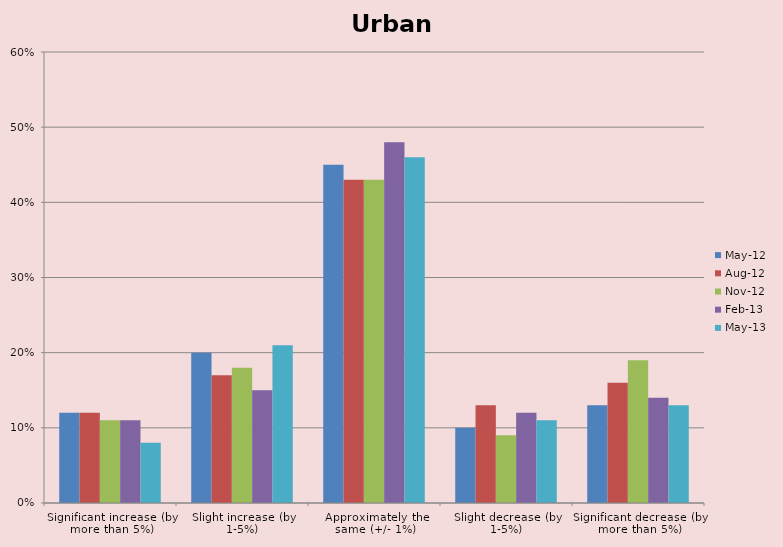
| Category | May-12 | Aug-12 | Nov-12 | Feb-13 | May-13 |
|---|---|---|---|---|---|
| Significant increase (by more than 5%) | 0.12 | 0.12 | 0.11 | 0.11 | 0.08 |
| Slight increase (by 1-5%) | 0.2 | 0.17 | 0.18 | 0.15 | 0.21 |
| Approximately the same (+/- 1%) | 0.45 | 0.43 | 0.43 | 0.48 | 0.46 |
| Slight decrease (by 1-5%) | 0.1 | 0.13 | 0.09 | 0.12 | 0.11 |
| Significant decrease (by more than 5%) | 0.13 | 0.16 | 0.19 | 0.14 | 0.13 |